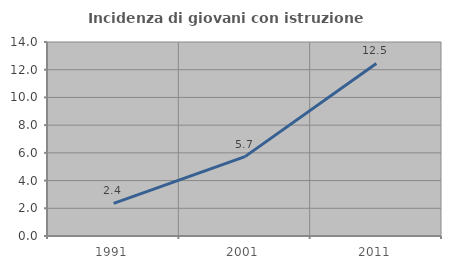
| Category | Incidenza di giovani con istruzione universitaria |
|---|---|
| 1991.0 | 2.351 |
| 2001.0 | 5.728 |
| 2011.0 | 12.454 |